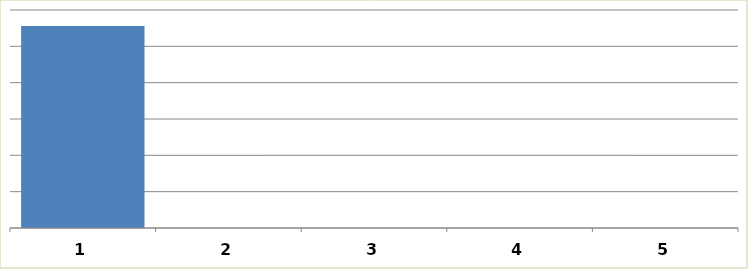
| Category | Series 0 |
|---|---|
| 0 | 5558944.118 |
| 1 | 0 |
| 2 | 0 |
| 3 | 0 |
| 4 | 0 |